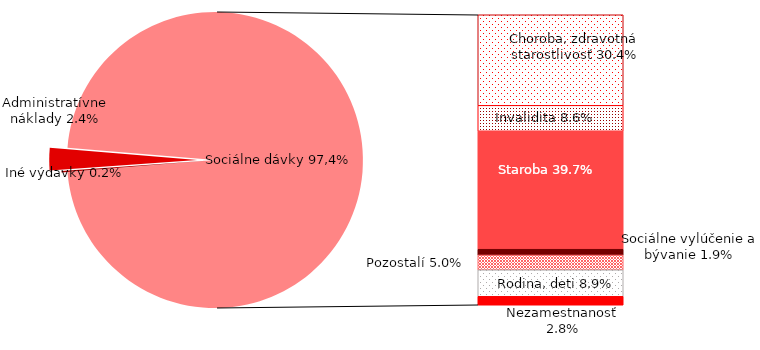
| Category | Series 0 |
|---|---|
| Iné výdavky | 0.18 |
| Administratívne náklady | 2.44 |
| Choroba, zdravotná starostlivosť | 30.42 |
| Invalidita | 8.61 |
| Staroba | 39.71 |
| Sociálne vylúčenie a bývanie | 1.93 |
| Pozostalí | 4.99 |
| Rodina, deti | 8.9 |
| Nezamestnanosť | 2.83 |